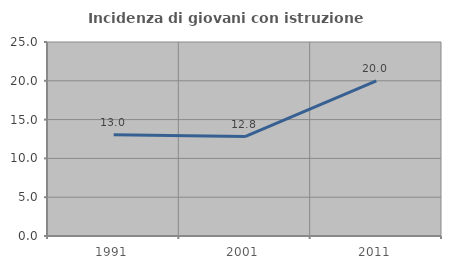
| Category | Incidenza di giovani con istruzione universitaria |
|---|---|
| 1991.0 | 13.043 |
| 2001.0 | 12.821 |
| 2011.0 | 20 |